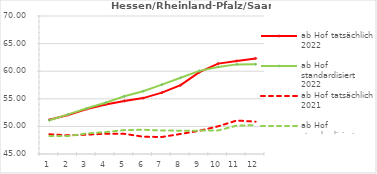
| Category | ab Hof tatsächlich 2022 | ab Hof standardisiert 2022 | ab Hof tatsächlich 2021 | ab Hof standardisiert 2021 |
|---|---|---|---|---|
| 0 | 51.189 | 51.11 | 48.573 | 48.247 |
| 1 | 52.08 | 52.17 | 48.382 | 48.243 |
| 2 | 53.141 | 53.279 | 48.512 | 48.732 |
| 3 | 53.98 | 54.292 | 48.665 | 48.97 |
| 4 | 54.617 | 55.452 | 48.654 | 49.335 |
| 5 | 55.125 | 56.38 | 48.13 | 49.394 |
| 6 | 56.118 | 57.567 | 48.082 | 49.251 |
| 7 | 57.471 | 58.809 | 48.633 | 49.23 |
| 8 | 59.835 | 60.064 | 49.21 | 49.233 |
| 9 | 61.375 | 60.765 | 50.016 | 49.269 |
| 10 | 61.868 | 61.235 | 51.072 | 50.147 |
| 11 | 62.312 | 61.27 | 50.856 | 50.238 |